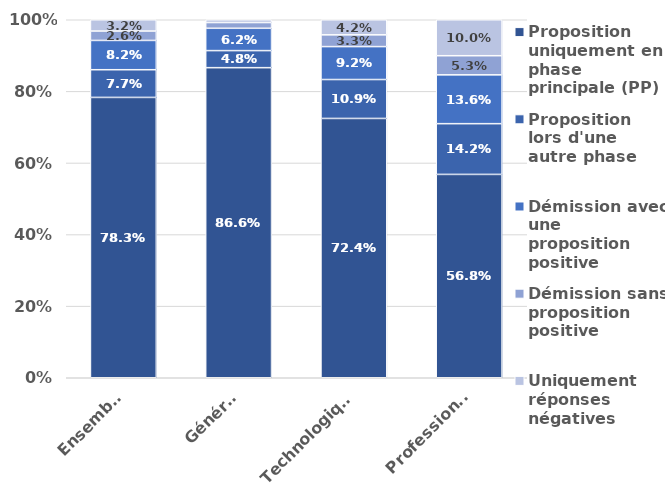
| Category | Proposition uniquement en phase principale (PP) | Proposition lors d'une autre phase | Démission avec une proposition positive | Démission sans proposition positive | Uniquement réponses négatives |
|---|---|---|---|---|---|
| Ensemble | 0.783 | 0.077 | 0.082 | 0.026 | 0.032 |
| Général | 0.866 | 0.048 | 0.062 | 0.016 | 0.008 |
| Technologique | 0.724 | 0.109 | 0.092 | 0.033 | 0.042 |
| Professionnel | 0.568 | 0.142 | 0.136 | 0.053 | 0.1 |